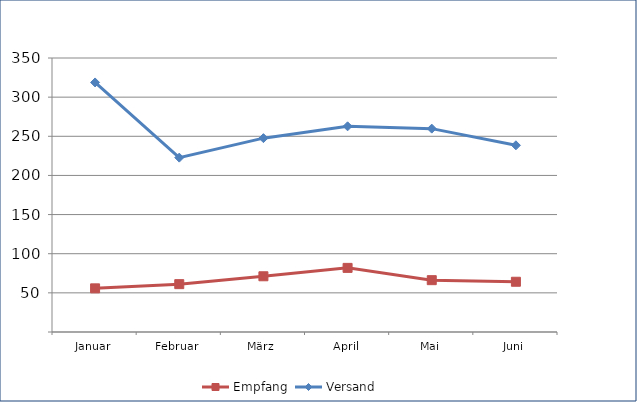
| Category | Empfang | Versand |
|---|---|---|
| Januar | 55.746 | 318.776 |
| Februar | 61.118 | 222.738 |
| März | 71.183 | 247.612 |
| April | 81.911 | 262.726 |
| Mai | 66.222 | 259.767 |
| Juni | 64.173 | 238.475 |